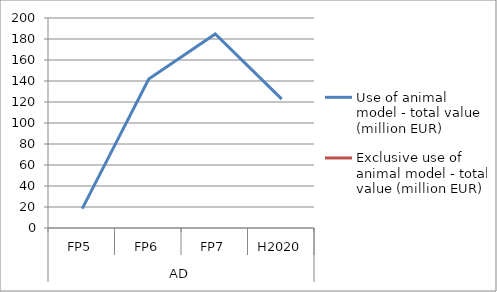
| Category | Use of animal model - total value (million EUR)   | Exclusive use of animal model - total value (million EUR) |
|---|---|---|
| 0 | 18.397 | 0 |
| 1 | 141.83 | 0 |
| 2 | 184.744 | 0 |
| 3 | 122.676 | 0 |